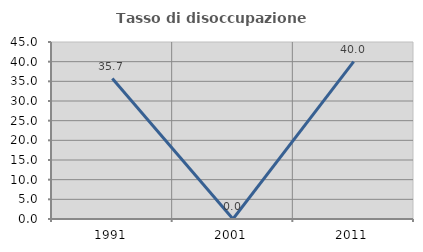
| Category | Tasso di disoccupazione giovanile  |
|---|---|
| 1991.0 | 35.714 |
| 2001.0 | 0 |
| 2011.0 | 40 |